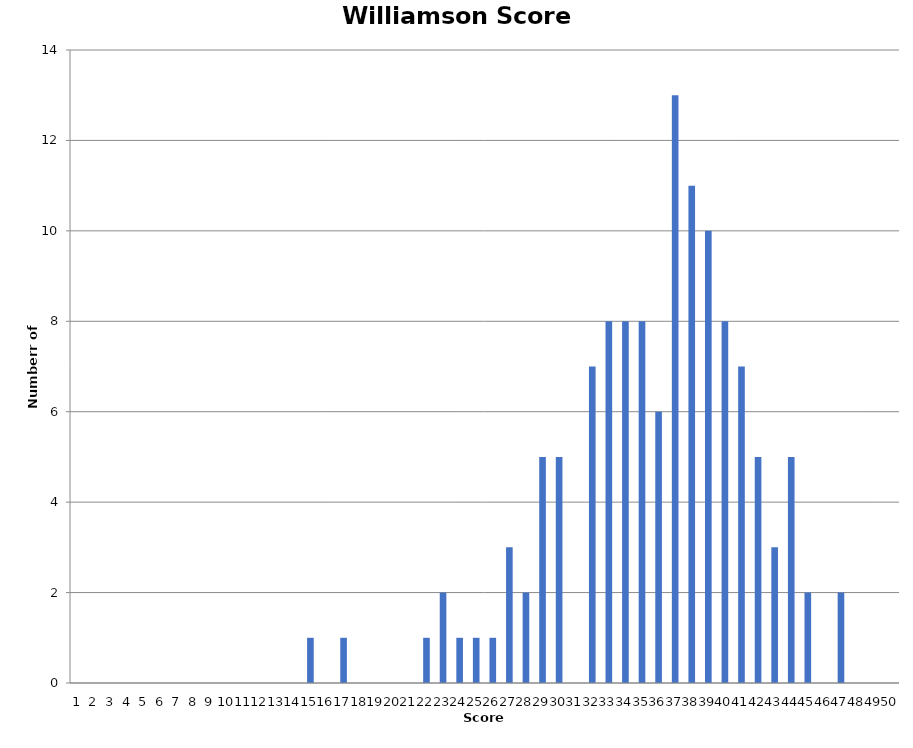
| Category | WIL |
|---|---|
| 0 | 0 |
| 1 | 0 |
| 2 | 0 |
| 3 | 0 |
| 4 | 0 |
| 5 | 0 |
| 6 | 0 |
| 7 | 0 |
| 8 | 0 |
| 9 | 0 |
| 10 | 0 |
| 11 | 0 |
| 12 | 0 |
| 13 | 0 |
| 14 | 1 |
| 15 | 0 |
| 16 | 1 |
| 17 | 0 |
| 18 | 0 |
| 19 | 0 |
| 20 | 0 |
| 21 | 1 |
| 22 | 2 |
| 23 | 1 |
| 24 | 1 |
| 25 | 1 |
| 26 | 3 |
| 27 | 2 |
| 28 | 5 |
| 29 | 5 |
| 30 | 0 |
| 31 | 7 |
| 32 | 8 |
| 33 | 8 |
| 34 | 8 |
| 35 | 6 |
| 36 | 13 |
| 37 | 11 |
| 38 | 10 |
| 39 | 8 |
| 40 | 7 |
| 41 | 5 |
| 42 | 3 |
| 43 | 5 |
| 44 | 2 |
| 45 | 0 |
| 46 | 2 |
| 47 | 0 |
| 48 | 0 |
| 49 | 0 |